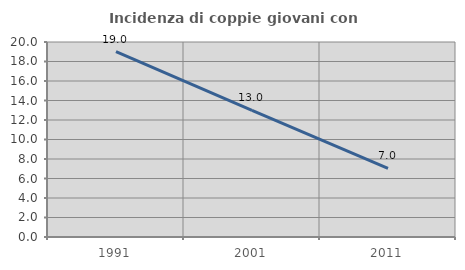
| Category | Incidenza di coppie giovani con figli |
|---|---|
| 1991.0 | 19.014 |
| 2001.0 | 12.982 |
| 2011.0 | 7.04 |